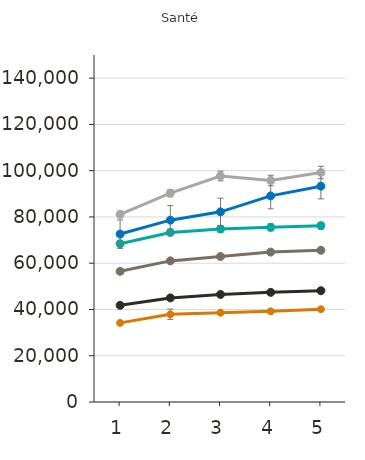
| Category | Certificat d'études collégial | Diplôme d'études collégial | Baccalauréat | Maîtrise | Doctorat | Grade professionnel |
|---|---|---|---|---|---|---|
| 1.0 | 34200 | 41800 | 56500 | 68400 | 72600 | 81100 |
| 2.0 | 37900 | 45000 | 61000 | 73300 | 78600 | 90300 |
| 3.0 | 38600 | 46500 | 62900 | 74800 | 82200 | 97700 |
| 4.0 | 39200 | 47400 | 64800 | 75500 | 89100 | 95800 |
| 5.0 | 40100 | 48100 | 65600 | 76200 | 93300 | 99200 |